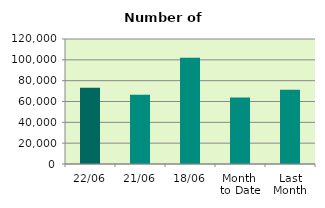
| Category | Series 0 |
|---|---|
| 22/06 | 73146 |
| 21/06 | 66560 |
| 18/06 | 101898 |
| Month 
to Date | 63898.5 |
| Last
Month | 71249.7 |